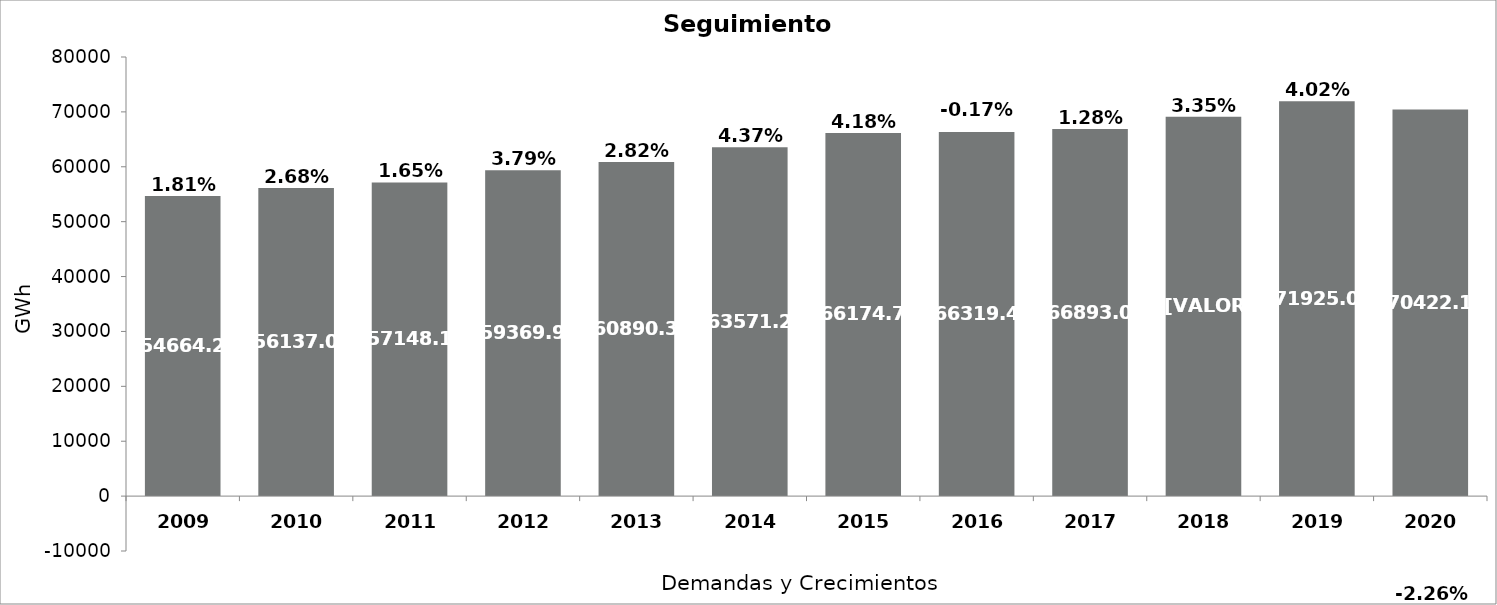
| Category | Demanda GWh |   |
|---|---|---|
| 2009.0 | 54664.213 | 0.018 |
| 2010.0 | 56137.031 | 0.027 |
| 2011.0 | 57148.181 | 0.016 |
| 2012.0 | 59369.895 | 0.038 |
| 2013.0 | 60890.316 | 0.028 |
| 2014.0 | 63571.227 | 0.044 |
| 2015.0 | 66174.749 | 0.042 |
| 2016.0 | 66319.48 | -0.002 |
| 2017.0 | 66893.037 | 0.013 |
| 2018.0 | 69126.732 | 0.034 |
| 2019.0 | 71925.021 | 0.04 |
| 2020.0 | 70422.134 | -0.023 |